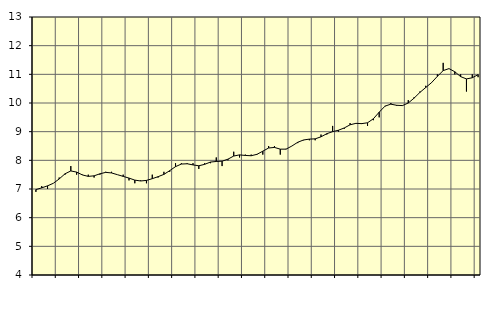
| Category | Piggar | Offentlig förvaltning m.m., SNI 84, 99 |
|---|---|---|
| nan | 6.9 | 6.98 |
| 1.0 | 7.1 | 7.04 |
| 1.0 | 7 | 7.11 |
| 1.0 | 7.2 | 7.2 |
| nan | 7.4 | 7.35 |
| 2.0 | 7.5 | 7.53 |
| 2.0 | 7.8 | 7.63 |
| 2.0 | 7.5 | 7.59 |
| nan | 7.5 | 7.49 |
| 3.0 | 7.5 | 7.44 |
| 3.0 | 7.4 | 7.46 |
| 3.0 | 7.5 | 7.53 |
| nan | 7.6 | 7.58 |
| 4.0 | 7.6 | 7.56 |
| 4.0 | 7.5 | 7.5 |
| 4.0 | 7.5 | 7.44 |
| nan | 7.3 | 7.38 |
| 5.0 | 7.2 | 7.31 |
| 5.0 | 7.3 | 7.28 |
| 5.0 | 7.2 | 7.3 |
| nan | 7.5 | 7.36 |
| 6.0 | 7.4 | 7.43 |
| 6.0 | 7.6 | 7.51 |
| 6.0 | 7.6 | 7.64 |
| nan | 7.9 | 7.78 |
| 7.0 | 7.9 | 7.87 |
| 7.0 | 7.9 | 7.88 |
| 7.0 | 7.9 | 7.84 |
| nan | 7.7 | 7.81 |
| 8.0 | 7.9 | 7.86 |
| 8.0 | 7.9 | 7.94 |
| 8.0 | 8.1 | 7.96 |
| nan | 7.8 | 7.97 |
| 9.0 | 8 | 8.04 |
| 9.0 | 8.3 | 8.15 |
| 9.0 | 8.1 | 8.19 |
| nan | 8.2 | 8.17 |
| 10.0 | 8.2 | 8.16 |
| 10.0 | 8.2 | 8.21 |
| 10.0 | 8.2 | 8.32 |
| nan | 8.5 | 8.43 |
| 11.0 | 8.5 | 8.45 |
| 11.0 | 8.2 | 8.39 |
| 11.0 | 8.4 | 8.39 |
| nan | 8.5 | 8.5 |
| 12.0 | 8.6 | 8.63 |
| 12.0 | 8.7 | 8.71 |
| 12.0 | 8.7 | 8.74 |
| nan | 8.7 | 8.75 |
| 13.0 | 8.9 | 8.82 |
| 13.0 | 8.9 | 8.93 |
| 13.0 | 9.2 | 9 |
| nan | 9 | 9.05 |
| 14.0 | 9.1 | 9.13 |
| 14.0 | 9.3 | 9.24 |
| 14.0 | 9.3 | 9.29 |
| nan | 9.3 | 9.28 |
| 15.0 | 9.2 | 9.31 |
| 15.0 | 9.4 | 9.45 |
| 15.0 | 9.5 | 9.68 |
| nan | 9.9 | 9.89 |
| 16.0 | 10 | 9.96 |
| 16.0 | 9.9 | 9.92 |
| 16.0 | 9.9 | 9.91 |
| nan | 10.1 | 10 |
| 17.0 | 10.2 | 10.17 |
| 17.0 | 10.4 | 10.37 |
| 17.0 | 10.6 | 10.54 |
| nan | 10.7 | 10.71 |
| 18.0 | 11 | 10.93 |
| 18.0 | 11.4 | 11.13 |
| 18.0 | 11.2 | 11.2 |
| nan | 11 | 11.09 |
| 19.0 | 11 | 10.92 |
| 19.0 | 10.4 | 10.84 |
| 19.0 | 11 | 10.88 |
| nan | 10.9 | 10.99 |